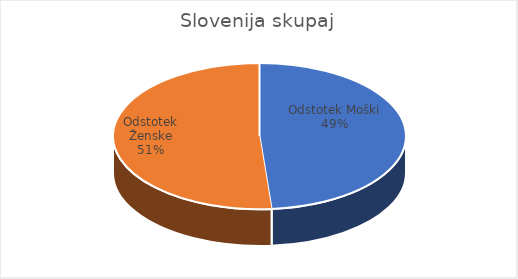
| Category | Slovenija skupaj |
|---|---|
| Odstotek Moški | 25.26 |
| Odstotek Ženske | 26.62 |